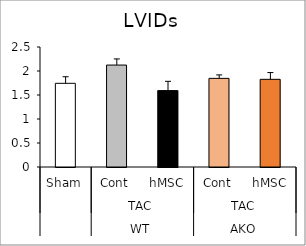
| Category | Series 0 |
|---|---|
| 0 | 1.743 |
| 1 | 2.124 |
| 2 | 1.592 |
| 3 | 1.847 |
| 4 | 1.827 |